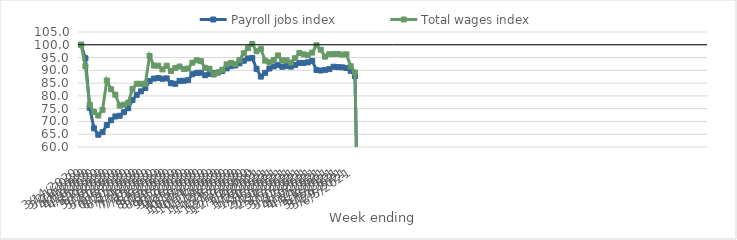
| Category | Payroll jobs index | Total wages index |
|---|---|---|
| 14/03/2020 | 100 | 100 |
| 21/03/2020 | 94.742 | 91.642 |
| 28/03/2020 | 75.352 | 76.605 |
| 04/04/2020 | 67.313 | 73.701 |
| 11/04/2020 | 64.801 | 72.312 |
| 18/04/2020 | 65.807 | 74.545 |
| 25/04/2020 | 68.603 | 86.013 |
| 02/05/2020 | 70.466 | 82.603 |
| 09/05/2020 | 71.954 | 80.441 |
| 16/05/2020 | 72.218 | 76.208 |
| 23/05/2020 | 73.619 | 76.572 |
| 30/05/2020 | 75.181 | 77.347 |
| 06/06/2020 | 78.357 | 82.747 |
| 13/06/2020 | 80.424 | 84.738 |
| 20/06/2020 | 81.783 | 84.738 |
| 27/06/2020 | 83.08 | 84.739 |
| 04/07/2020 | 85.831 | 95.61 |
| 11/07/2020 | 86.768 | 91.859 |
| 18/07/2020 | 87.013 | 91.814 |
| 25/07/2020 | 86.691 | 90.353 |
| 01/08/2020 | 86.852 | 91.8 |
| 08/08/2020 | 84.956 | 89.728 |
| 15/08/2020 | 84.728 | 90.912 |
| 22/08/2020 | 85.855 | 91.489 |
| 29/08/2020 | 85.915 | 90.491 |
| 05/09/2020 | 86.151 | 90.691 |
| 12/09/2020 | 88.489 | 92.996 |
| 19/09/2020 | 89.004 | 93.944 |
| 26/09/2020 | 89.067 | 93.584 |
| 03/10/2020 | 88.068 | 90.965 |
| 10/10/2020 | 88.604 | 90.638 |
| 17/10/2020 | 88.92 | 88.342 |
| 24/10/2020 | 89.16 | 89.124 |
| 31/10/2020 | 89.74 | 90.2 |
| 07/11/2020 | 90.772 | 92.337 |
| 14/11/2020 | 91.65 | 92.898 |
| 21/11/2020 | 91.902 | 92.495 |
| 28/11/2020 | 92.714 | 94.015 |
| 05/12/2020 | 93.752 | 96.685 |
| 12/12/2020 | 94.662 | 98.647 |
| 19/12/2020 | 94.84 | 100.303 |
| 26/12/2020 | 90.573 | 97.468 |
| 02/01/2021 | 87.546 | 98.441 |
| 09/01/2021 | 89.011 | 93.797 |
| 16/01/2021 | 90.712 | 93.167 |
| 23/01/2021 | 91.527 | 94.077 |
| 30/01/2021 | 92.118 | 95.828 |
| 06/02/2021 | 91.4 | 93.85 |
| 13/02/2021 | 91.744 | 93.901 |
| 20/02/2021 | 91.461 | 93.017 |
| 27/02/2021 | 92.105 | 94.748 |
| 06/03/2021 | 92.88 | 96.811 |
| 13/03/2021 | 92.922 | 96.26 |
| 20/03/2021 | 93.139 | 95.891 |
| 27/03/2021 | 93.709 | 96.94 |
| 03/04/2021 | 90.14 | 99.802 |
| 10/04/2021 | 89.931 | 98.07 |
| 17/04/2021 | 90.191 | 95.355 |
| 24/04/2021 | 90.47 | 96.299 |
| 01/05/2021 | 91.399 | 96.399 |
| 08/05/2021 | 91.257 | 96.429 |
| 15/05/2021 | 91.179 | 96.16 |
| 22/05/2021 | 90.899 | 96.255 |
| 29/05/2021 | 89.802 | 91.605 |
| 05/06/2021 | 87.744 | 89.134 |